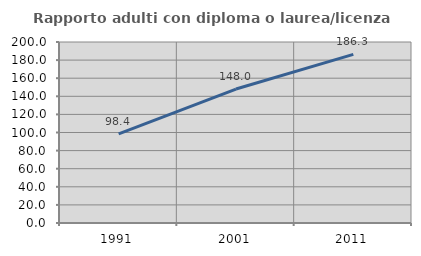
| Category | Rapporto adulti con diploma o laurea/licenza media  |
|---|---|
| 1991.0 | 98.403 |
| 2001.0 | 148.03 |
| 2011.0 | 186.283 |